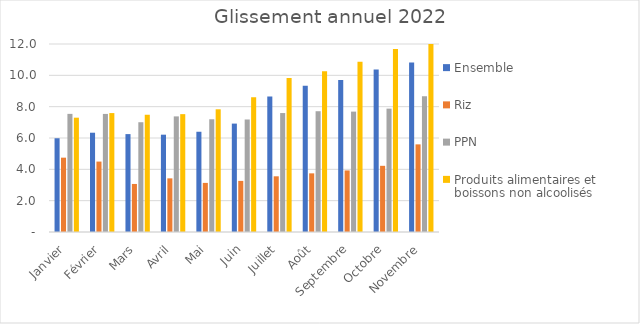
| Category |  Ensemble  |  Riz  |  PPN  |  Produits alimentaires et boissons non alcoolisés  |
|---|---|---|---|---|
| Janvier | 5.984 | 4.745 | 7.54 | 7.297 |
| Février | 6.337 | 4.495 | 7.537 | 7.591 |
| Mars | 6.249 | 3.066 | 7.006 | 7.484 |
| Avril | 6.212 | 3.424 | 7.38 | 7.523 |
| Mai | 6.399 | 3.134 | 7.195 | 7.832 |
| Juin | 6.919 | 3.263 | 7.182 | 8.599 |
| Juillet | 8.653 | 3.555 | 7.593 | 9.833 |
| Août | 9.327 | 3.744 | 7.709 | 10.254 |
| Septembre | 9.698 | 3.929 | 7.684 | 10.86 |
| Octobre | 10.366 | 4.224 | 7.875 | 11.681 |
| Novembre | 10.824 | 5.593 | 8.673 | 12.372 |